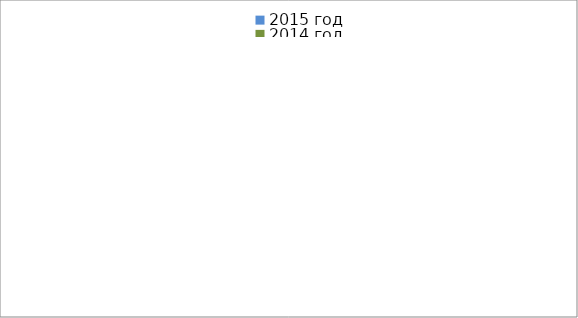
| Category | 2015 год | 2014 год |
|---|---|---|
|  - поджог | 18 | 16 |
|  - неосторожное обращение с огнём | 51 | 31 |
|  - НПТЭ электрооборудования | 8 | 17 |
|  - НПУ и Э печей | 50 | 51 |
|  - НПУ и Э транспортных средств | 41 | 47 |
|   -Шалость с огнем детей | 3 | 0 |
|  -НППБ при эксплуатации эл.приборов | 11 | 17 |
|  - курение | 19 | 18 |
| - прочие | 73 | 74 |
| - не установленные причины | 9 | 7 |